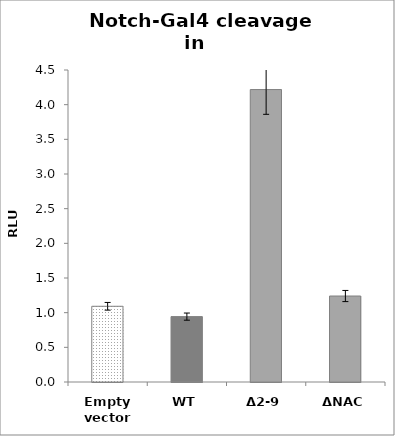
| Category | Series 0 |
|---|---|
| Empty vector | 1.092 |
| WT | 0.943 |
| Δ2-9 | 4.218 |
| ΔNAC | 1.24 |